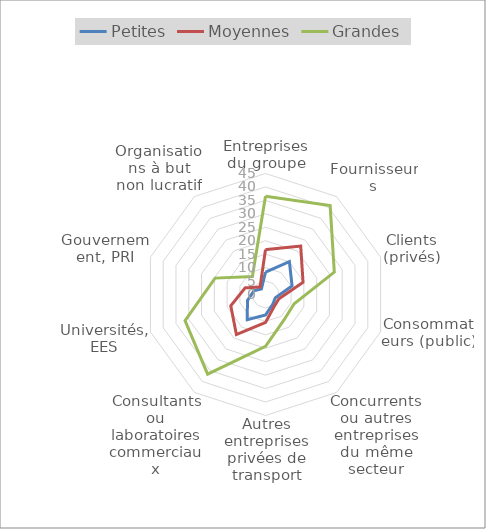
| Category | Petites | Moyennes | Grandes |
|---|---|---|---|
| Entreprises du groupe | 8.303 | 16.69 | 36.552 |
| Fournisseurs | 15.114 | 22.268 | 40.9 |
| Clients (privés) | 10.39 | 14.679 | 26.907 |
| Consommateurs (public) | 3.876 | 5.236 | 11.204 |
| Concurrents ou autres entreprises du même secteur | 4.546 | 5.496 | 11.704 |
| Autres entreprises privées de transport | 7.634 | 10.4 | 19.266 |
| Consultants ou laboratoires commerciaux | 11.586 | 18.411 | 36.625 |
| Universités, EES | 7.031 | 13.575 | 31.461 |
| Gouvernement, PRI | 4.493 | 7.968 | 19.714 |
| Organisations à but non lucratif | 2.579 | 3.45 | 8.304 |